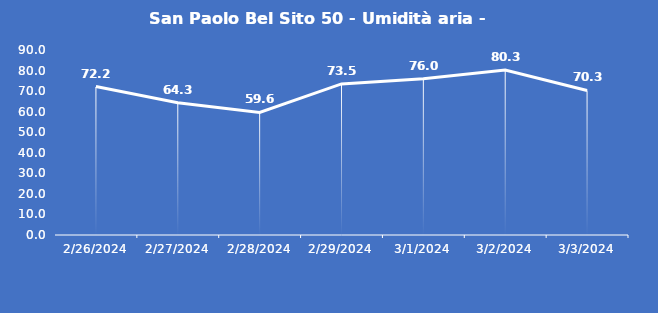
| Category | San Paolo Bel Sito 50 - Umidità aria - Grezzo (%) |
|---|---|
| 2/26/24 | 72.2 |
| 2/27/24 | 64.3 |
| 2/28/24 | 59.6 |
| 2/29/24 | 73.5 |
| 3/1/24 | 76 |
| 3/2/24 | 80.3 |
| 3/3/24 | 70.3 |